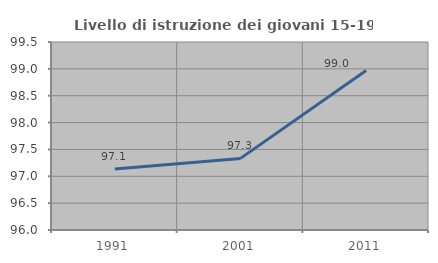
| Category | Livello di istruzione dei giovani 15-19 anni |
|---|---|
| 1991.0 | 97.134 |
| 2001.0 | 97.333 |
| 2011.0 | 98.969 |